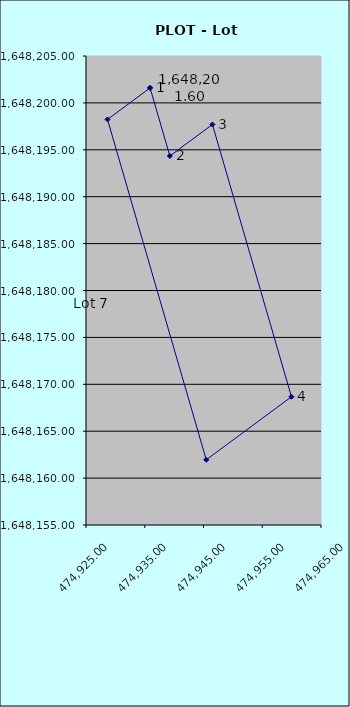
| Category | "B4L10" |
|---|---|
| 474935.91 | 1648201.6 |
| 474939.27 | 1648194.34 |
| 474946.52 | 1648197.7 |
| 474959.97 | 1648168.67 |
| 474945.47 | 1648161.95 |
| 474928.66 | 1648198.24 |
| 474935.91 | 1648201.6 |